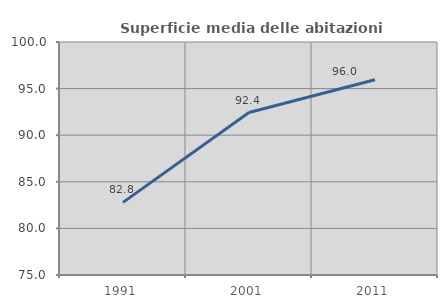
| Category | Superficie media delle abitazioni occupate |
|---|---|
| 1991.0 | 82.791 |
| 2001.0 | 92.431 |
| 2011.0 | 95.957 |